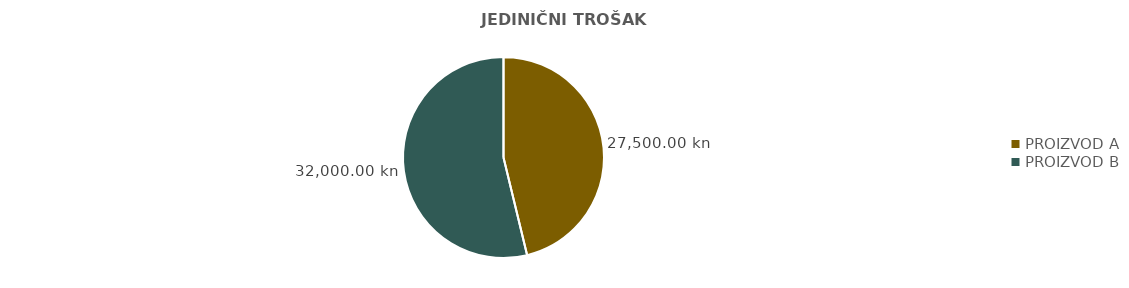
| Category | JEDINIČNI TROŠAK PROIZVODA |
|---|---|
| PROIZVOD A | 27500 |
| PROIZVOD B | 32000 |